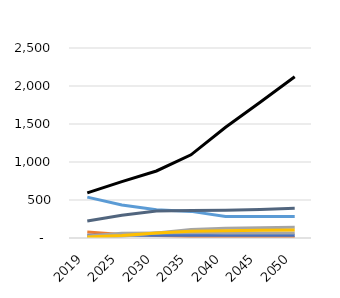
| Category | liquids | natural gas | coal | nuclear | hydro | other | wind | solar |
|---|---|---|---|---|---|---|---|---|
| 2019.0 | 77.92 | 538.19 | 593.2 | 37.21 | 224.79 | 26.84 | 9.54 | 11.95 |
| 2025.0 | 47.72 | 433.59 | 741.3 | 37.27 | 298.72 | 61.18 | 22.83 | 31.81 |
| 2030.0 | 31.63 | 372.09 | 881.84 | 37.27 | 355.01 | 65.64 | 64.74 | 65.71 |
| 2035.0 | 20.73 | 350.22 | 1094.63 | 37.27 | 362.34 | 72.18 | 111.65 | 89.72 |
| 2040.0 | 13.36 | 282.57 | 1457.29 | 37.27 | 366.33 | 65.88 | 128.57 | 95.95 |
| 2045.0 | 8.36 | 282.57 | 1785.1 | 37.27 | 375.86 | 65.98 | 134.64 | 100.45 |
| 2050.0 | 5.22 | 282.57 | 2121.08 | 37.27 | 391.9 | 66.09 | 140.79 | 105.23 |